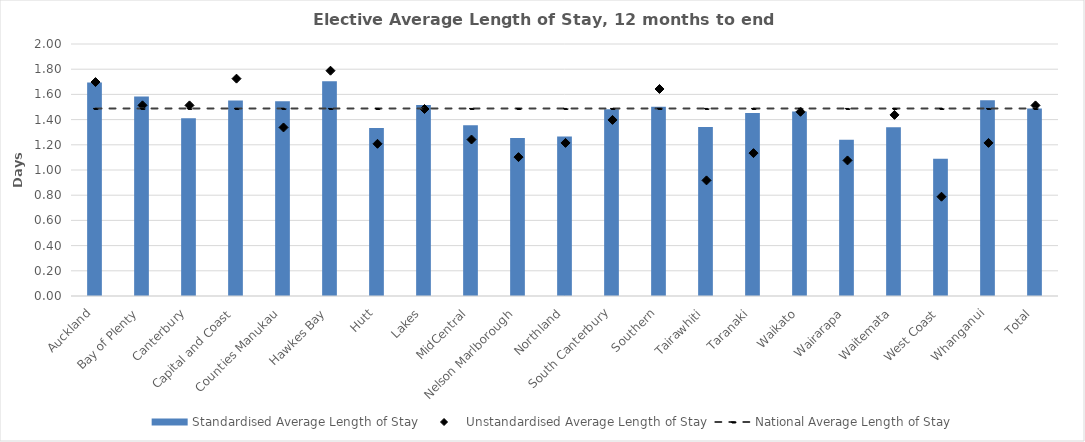
| Category | Standardised Average Length of Stay |
|---|---|
| Auckland | 1.694 |
| Bay of Plenty | 1.583 |
| Canterbury | 1.411 |
| Capital and Coast | 1.552 |
| Counties Manukau | 1.546 |
| Hawkes Bay | 1.704 |
| Hutt | 1.334 |
| Lakes | 1.516 |
| MidCentral | 1.355 |
| Nelson Marlborough | 1.254 |
| Northland | 1.265 |
| South Canterbury | 1.482 |
| Southern | 1.503 |
| Tairawhiti | 1.342 |
| Taranaki | 1.451 |
| Waikato | 1.463 |
| Wairarapa | 1.241 |
| Waitemata | 1.339 |
| West Coast | 1.09 |
| Whanganui | 1.554 |
| Total | 1.489 |